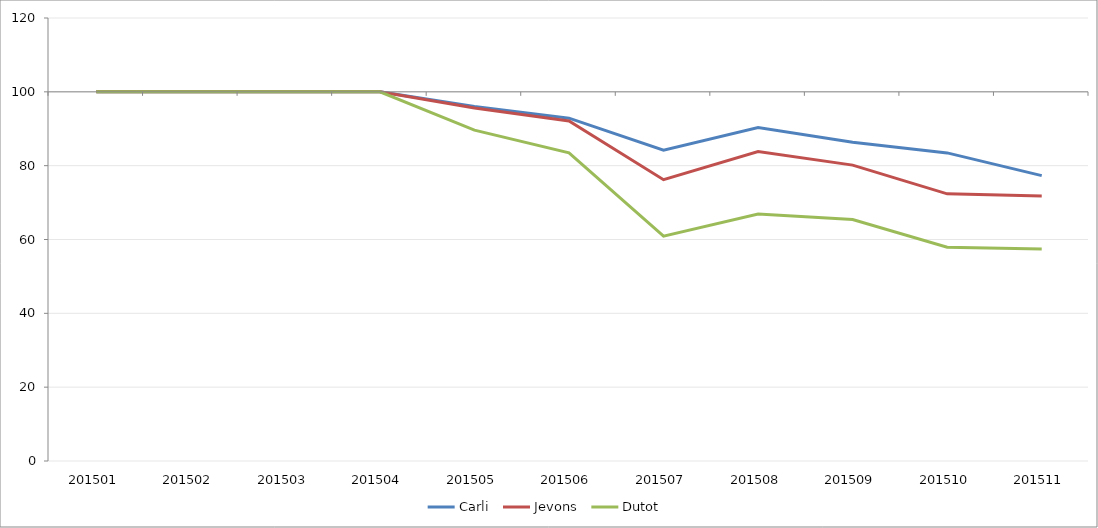
| Category | Carli | Jevons | Dutot |
|---|---|---|---|
| 201501.0 | 100 | 100 | 100 |
| 201502.0 | 100 | 100 | 100 |
| 201503.0 | 100 | 100 | 100 |
| 201504.0 | 100 | 100 | 100 |
| 201505.0 | 96 | 95.635 | 89.623 |
| 201506.0 | 92.87 | 92.104 | 83.457 |
| 201507.0 | 84.174 | 76.206 | 60.899 |
| 201508.0 | 90.357 | 83.802 | 66.915 |
| 201509.0 | 86.357 | 80.144 | 65.411 |
| 201510.0 | 83.459 | 72.361 | 57.892 |
| 201511.0 | 77.31 | 71.772 | 57.44 |